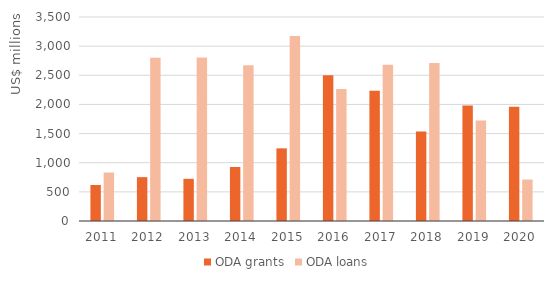
| Category | ODA grants | ODA loans |
|---|---|---|
| 2011.0 | 617.281 | 831.778 |
| 2012.0 | 752.497 | 2802.492 |
| 2013.0 | 723.319 | 2803.438 |
| 2014.0 | 926.586 | 2672.18 |
| 2015.0 | 1246.78 | 3175.118 |
| 2016.0 | 2500.172 | 2266.638 |
| 2017.0 | 2233.397 | 2680.905 |
| 2018.0 | 1537.223 | 2709.865 |
| 2019.0 | 1981.746 | 1725.845 |
| 2020.0 | 1958.512 | 711.55 |